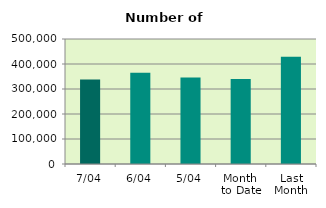
| Category | Series 0 |
|---|---|
| 7/04 | 337532 |
| 6/04 | 364896 |
| 5/04 | 346190 |
| Month 
to Date | 340052.8 |
| Last
Month | 428970.609 |